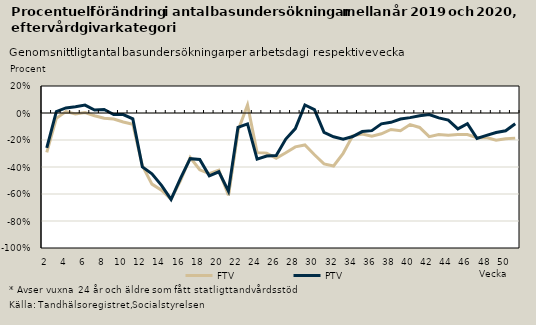
| Category | FTV | PTV |
|---|---|---|
| 2.0 | -0.291 | -0.258 |
| 3.0 | -0.04 | 0.01 |
| 4.0 | 0.01 | 0.038 |
| 5.0 | -0.008 | 0.046 |
| 6.0 | 0.003 | 0.059 |
| 7.0 | -0.02 | 0.022 |
| 8.0 | -0.039 | 0.026 |
| 9.0 | -0.045 | -0.011 |
| 10.0 | -0.067 | -0.011 |
| 11.0 | -0.083 | -0.044 |
| 12.0 | -0.391 | -0.4 |
| 13.0 | -0.527 | -0.451 |
| 14.0 | -0.571 | -0.536 |
| 15.0 | -0.64 | -0.64 |
| 16.0 | -0.5 | -0.483 |
| 17.0 | -0.33 | -0.338 |
| 18.0 | -0.421 | -0.344 |
| 19.0 | -0.45 | -0.466 |
| 20.0 | -0.424 | -0.436 |
| 21.0 | -0.61 | -0.579 |
| 22.0 | -0.131 | -0.107 |
| 23.0 | 0.059 | -0.08 |
| 24.0 | -0.292 | -0.341 |
| 25.0 | -0.297 | -0.319 |
| 26.0 | -0.335 | -0.315 |
| 27.0 | -0.294 | -0.193 |
| 28.0 | -0.251 | -0.116 |
| 29.0 | -0.237 | 0.059 |
| 30.0 | -0.31 | 0.025 |
| 31.0 | -0.377 | -0.144 |
| 32.0 | -0.393 | -0.176 |
| 33.0 | -0.299 | -0.194 |
| 34.0 | -0.17 | -0.175 |
| 35.0 | -0.155 | -0.138 |
| 36.0 | -0.171 | -0.131 |
| 37.0 | -0.154 | -0.08 |
| 38.0 | -0.122 | -0.069 |
| 39.0 | -0.131 | -0.045 |
| 40.0 | -0.086 | -0.034 |
| 41.0 | -0.107 | -0.02 |
| 42.0 | -0.175 | -0.012 |
| 43.0 | -0.16 | -0.036 |
| 44.0 | -0.164 | -0.052 |
| 45.0 | -0.16 | -0.118 |
| 46.0 | -0.159 | -0.079 |
| 47.0 | -0.183 | -0.188 |
| 48.0 | -0.181 | -0.166 |
| 49.0 | -0.202 | -0.144 |
| 50.0 | -0.192 | -0.132 |
| 51.0 | -0.186 | -0.08 |